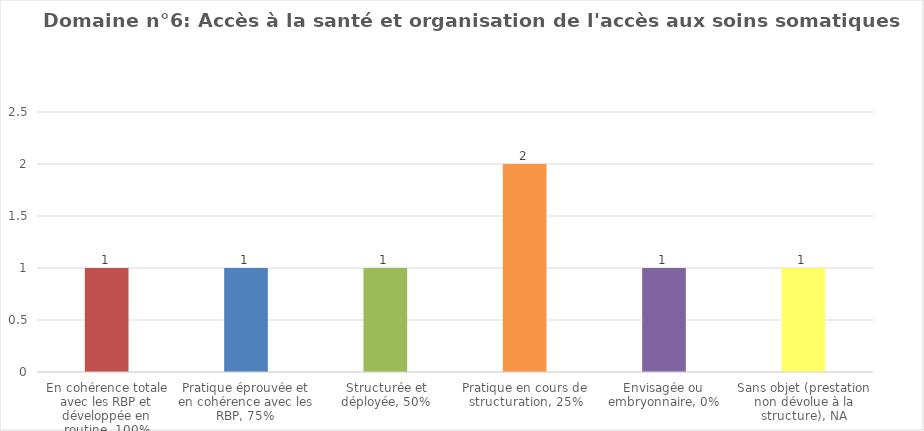
| Category | Domaine n°6: Accès à la santé et organisation de l'accès aux soins somatiques |
|---|---|
| En cohérence totale avec les RBP et développée en routine, 100% | 1 |
| Pratique éprouvée et en cohérence avec les RBP, 75% | 1 |
| Structurée et déployée, 50% | 1 |
| Pratique en cours de structuration, 25% | 2 |
| Envisagée ou embryonnaire, 0% | 1 |
| Sans objet (prestation non dévolue à la structure), NA | 1 |